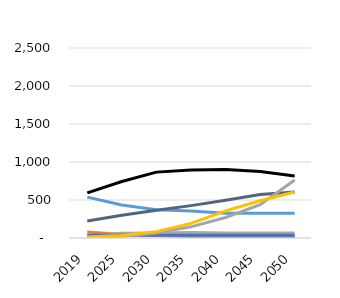
| Category | liquids | natural gas | coal | hydro | other | nuclear | wind | solar |
|---|---|---|---|---|---|---|---|---|
| 2019.0 | 77.92 | 538.19 | 593.2 | 224.79 | 26.84 | 37.21 | 9.54 | 11.95 |
| 2025.0 | 47.72 | 433.59 | 742.9 | 298.81 | 61.18 | 37.27 | 22.96 | 34.2 |
| 2030.0 | 31.63 | 372.09 | 866.76 | 364.41 | 65.64 | 37.27 | 64.75 | 83.73 |
| 2035.0 | 20.73 | 356.69 | 895.23 | 426.16 | 71 | 37.27 | 146.81 | 192.63 |
| 2040.0 | 16.51 | 325.18 | 901.8 | 497.04 | 65.88 | 37.27 | 270.46 | 357.81 |
| 2045.0 | 14.67 | 325.18 | 875.4 | 571.82 | 65.95 | 37.27 | 437.26 | 489.39 |
| 2050.0 | 14.44 | 325.18 | 816.78 | 604.03 | 65.94 | 37.27 | 763.14 | 605.98 |